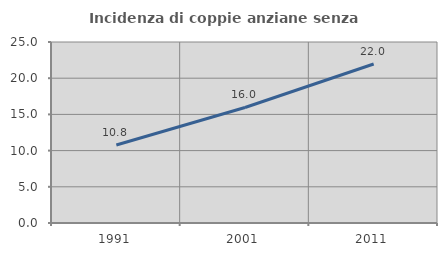
| Category | Incidenza di coppie anziane senza figli  |
|---|---|
| 1991.0 | 10.778 |
| 2001.0 | 15.959 |
| 2011.0 | 21.955 |